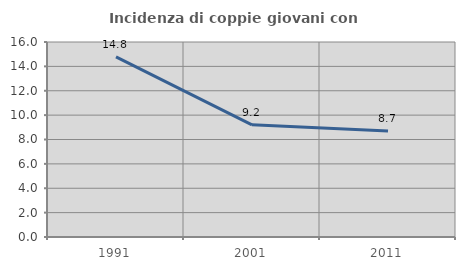
| Category | Incidenza di coppie giovani con figli |
|---|---|
| 1991.0 | 14.783 |
| 2001.0 | 9.204 |
| 2011.0 | 8.699 |